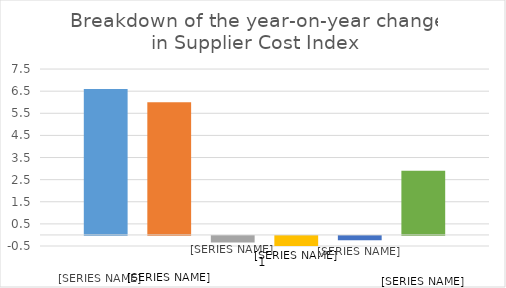
| Category | Wholesale (gas)  | Wholesale (electricity) | Network (gas)  | Network (electricity) | Government obligations (gas) | Government obligations (electricity) |
|---|---|---|---|---|---|---|
| 0 | 6.6 | 6 | -0.3 | -0.5 | -0.2 | 2.9 |